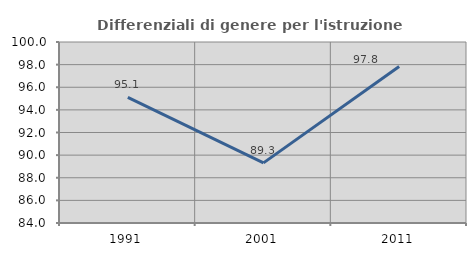
| Category | Differenziali di genere per l'istruzione superiore |
|---|---|
| 1991.0 | 95.106 |
| 2001.0 | 89.313 |
| 2011.0 | 97.83 |